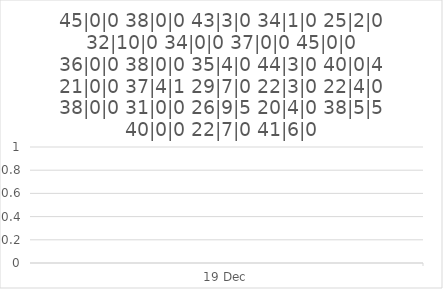
| Category | 45|0|0 |
|---|---|
| 2016-12-19 | 0 |